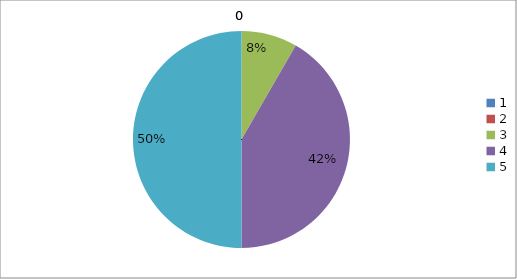
| Category | Series 0 |
|---|---|
| 0 | 0 |
| 1 | 0 |
| 2 | 0.083 |
| 3 | 0.417 |
| 4 | 0.5 |